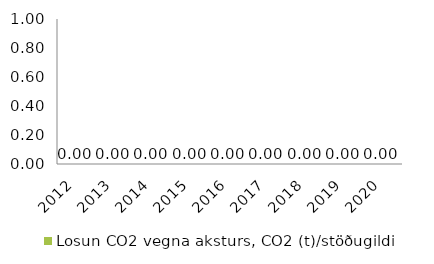
| Category | Losun CO2 vegna aksturs, CO2 (t)/stöðugildi |
|---|---|
| 2012.0 | 0 |
| 2013.0 | 0 |
| 2014.0 | 0 |
| 2015.0 | 0 |
| 2016.0 | 0 |
| 2017.0 | 0 |
| 2018.0 | 0 |
| 2019.0 | 0 |
| 2020.0 | 0 |